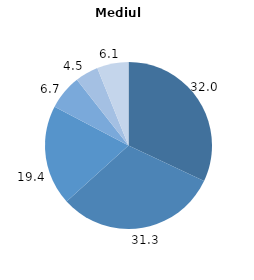
| Category | Mediul rural |
|---|---|
| 0 | 32 |
| 1 | 31.3 |
| 2 | 19.4 |
| 3 | 6.7 |
| 4 | 4.5 |
| 5 | 6.1 |